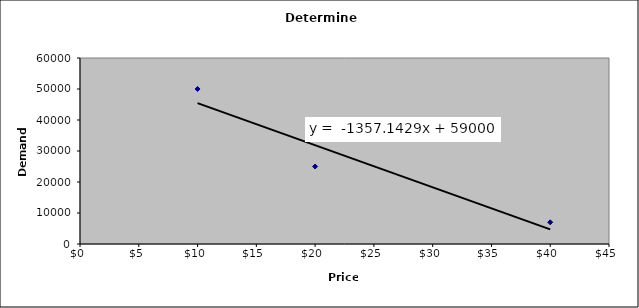
| Category | Series 0 |
|---|---|
| 20.0 | 25000 |
| 10.0 | 50000 |
| 40.0 | 7000 |